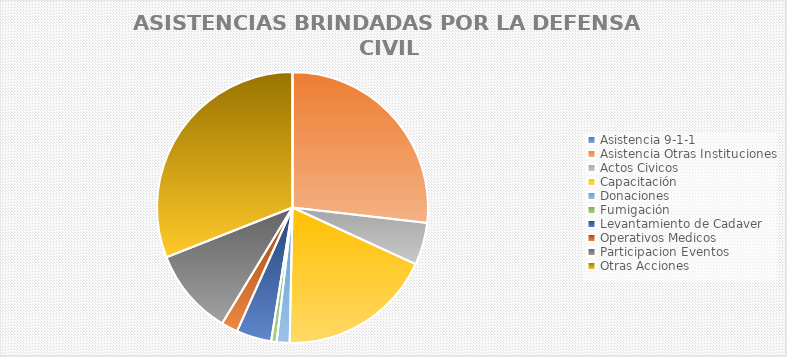
| Category | Series 0 |
|---|---|
| Asistencia 9-1-1 | 0 |
| Asistencia Otras Instituciones | 122 |
| Actos Civicos | 23 |
| Capacitación | 84 |
| Donaciones | 7 |
| Fumigación | 3 |
| Levantamiento de Cadaver | 19 |
| Operativos Medicos | 9 |
| Participacion Eventos | 47 |
| Otras Acciones | 141 |